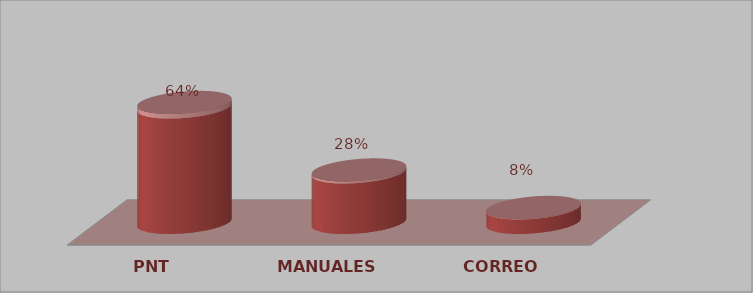
| Category | Series 0 | Series 1 |
|---|---|---|
| PNT | 16 | 0.64 |
| MANUALES | 7 | 0.28 |
| CORREO | 2 | 0.08 |